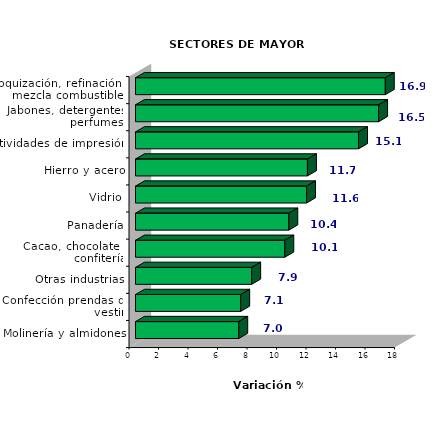
| Category | Series 0 |
|---|---|
| Coquización, refinación y mezcla combustibles | 16.931 |
| Jabones, detergentes, perfumes  | 16.477 |
| Actividades de impresión | 15.118 |
| Hierro y acero | 11.653 |
| Vidrio | 11.59 |
| Panadería | 10.389 |
| Cacao, chocolate y confitería | 10.12 |
| Otras industrias | 7.874 |
| Confección prendas de vestir | 7.129 |
| Molinería y almidones | 6.997 |